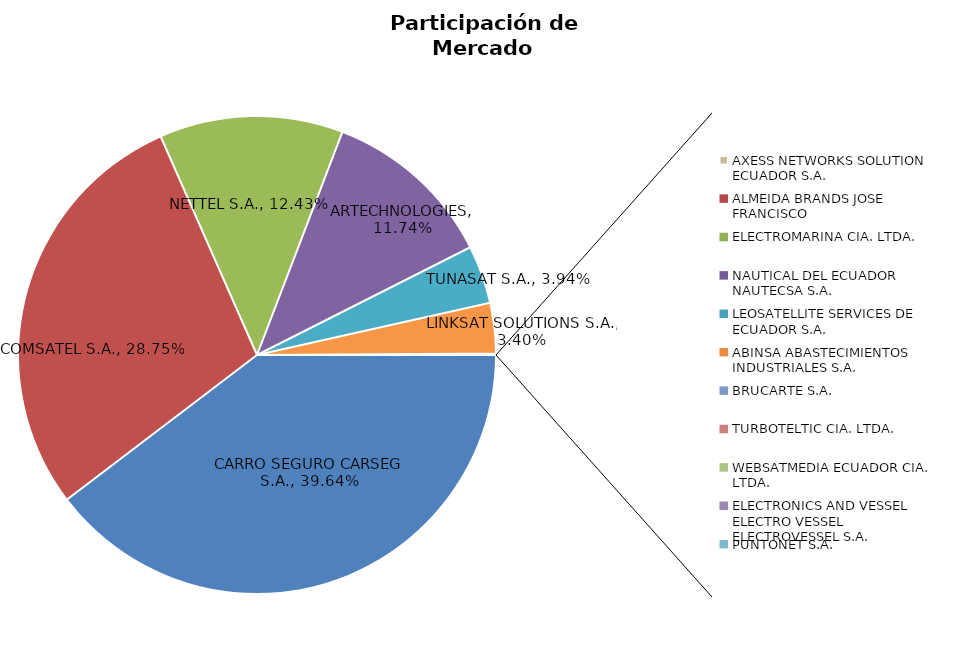
| Category | Series 0 |
|---|---|
| CARRO SEGURO CARSEG S.A. | 0.396 |
| COMSATEL S.A. | 0.287 |
| NETTEL S.A. | 0.124 |
| ARTECHNOLOGIES | 0.117 |
| TUNASAT S.A. | 0.039 |
| LINKSAT SOLUTIONS S.A. | 0.034 |
| AXESS NETWORKS SOLUTION ECUADOR S.A. | 0.001 |
| ALMEIDA BRANDS JOSE FRANCISCO | 0 |
| ELECTROMARINA CIA. LTDA. | 0 |
| NAUTICAL DEL ECUADOR NAUTECSA S.A. | 0 |
| LEOSATELLITE SERVICES DE ECUADOR S.A. | 0 |
| ABINSA ABASTECIMIENTOS INDUSTRIALES S.A. | 0 |
| BRUCARTE S.A. | 0 |
| TURBOTELTIC CIA. LTDA. | 0 |
| WEBSATMEDIA ECUADOR CIA. LTDA. | 0 |
| ELECTRONICS AND VESSEL ELECTRO VESSEL ELECTROVESSEL S.A. | 0 |
| PUNTONET S.A. | 0 |
| INFOPRONT S.A. | 0 |
| IELCO INSTALACIONES ELECTRICAS Y CONSTRUCCIONES C. LTDA. | 0 |